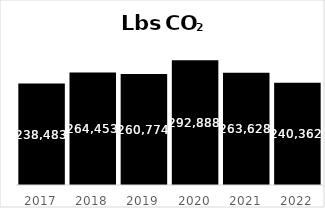
| Category | Series 0 |
|---|---|
| 2017.0 | 238483 |
| 2018.0 | 264453 |
| 2019.0 | 260773.86 |
| 2020.0 | 292887.5 |
| 2021.0 | 263627.9 |
| 2022.0 | 240361.6 |